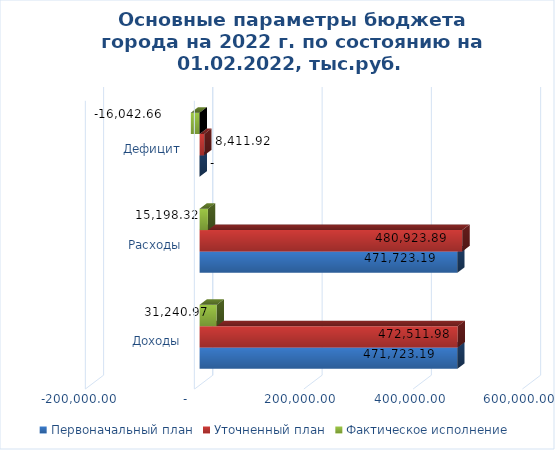
| Category | Первоначальный план | Уточненный план | Фактическое исполнение |
|---|---|---|---|
| Доходы | 471723.193 | 472511.977 | 31240.972 |
| Расходы | 471723.193 | 480923.895 | 15198.317 |
| Дефицит | 0 | 8411.918 | -16042.656 |